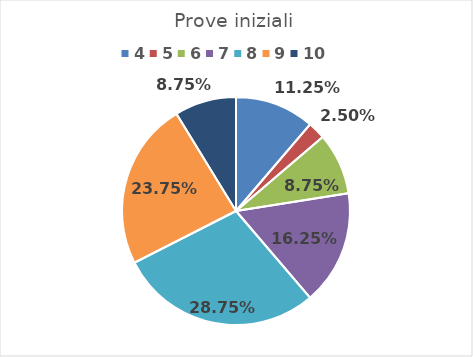
| Category | Series 0 |
|---|---|
| 4.0 | 0.112 |
| 5.0 | 0.025 |
| 6.0 | 0.088 |
| 7.0 | 0.162 |
| 8.0 | 0.288 |
| 9.0 | 0.238 |
| 10.0 | 0.088 |